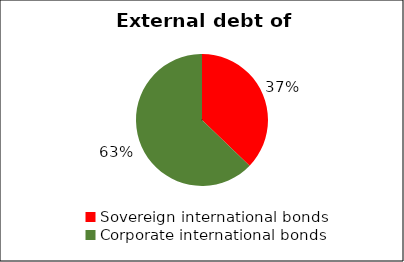
| Category | International bond market volume |
|---|---|
| Sovereign international bonds | 2.811 |
| Corporate international bonds | 4.75 |